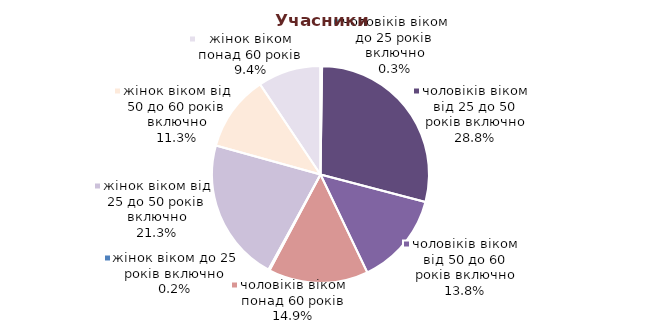
| Category | Series 0 |
|---|---|
| жінок віком до 25 років включно | 1594 |
| жінок віком від 25 до 50 років включно | 186641 |
| жінок віком від 50 до 60 років включно | 98862 |
| жінок віком понад 60 років | 82033 |
| чоловіків віком до 25 років включно | 2257 |
| чоловіків віком від 25 до 50 років включно | 252312 |
| чоловіків віком від 50 до 60 років включно | 120927 |
| чоловіків віком понад 60 років | 130084 |